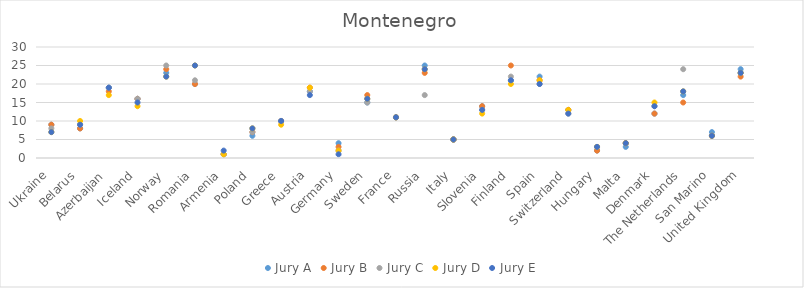
| Category | Jury A | Jury B | Jury C | Jury D | Jury E |
|---|---|---|---|---|---|
| Ukraine | 9 | 9 | 8 | 7 | 7 |
| Belarus | 8 | 8 | 9 | 10 | 9 |
| Azerbaijan | 19 | 18 | 19 | 17 | 19 |
| Iceland | 16 | 16 | 16 | 14 | 15 |
| Norway | 23 | 24 | 25 | 22 | 22 |
| Romania | 20 | 20 | 21 | 25 | 25 |
| Armenia | 1 | 1 | 1 | 1 | 2 |
| Poland | 6 | 7 | 7 | 8 | 8 |
| Greece | 10 | 10 | 10 | 9 | 10 |
| Austria | 18 | 19 | 18 | 19 | 17 |
| Germany | 4 | 3 | 2 | 2 | 1 |
| Sweden | 15 | 17 | 15 | 16 | 16 |
| France | 11 | 11 | 11 | 11 | 11 |
| Russia | 25 | 23 | 17 | 24 | 24 |
| Italy | 5 | 5 | 5 | 5 | 5 |
| Slovenia | 14 | 14 | 13 | 12 | 13 |
| Finland | 21 | 25 | 22 | 20 | 21 |
| Spain | 22 | 21 | 20 | 21 | 20 |
| Switzerland | 13 | 13 | 12 | 13 | 12 |
| Hungary | 2 | 2 | 3 | 3 | 3 |
| Malta | 3 | 4 | 4 | 4 | 4 |
| Denmark | 12 | 12 | 14 | 15 | 14 |
| The Netherlands | 17 | 15 | 24 | 18 | 18 |
| San Marino | 7 | 6 | 6 | 6 | 6 |
| United Kingdom | 24 | 22 | 23 | 23 | 23 |